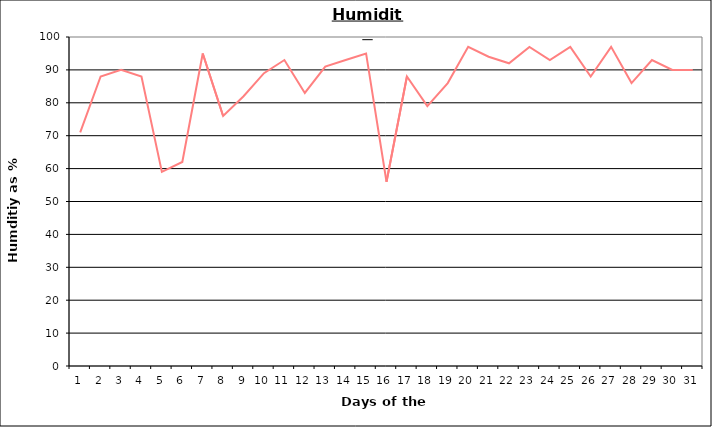
| Category | Series 0 |
|---|---|
| 0 | 71 |
| 1 | 88 |
| 2 | 90 |
| 3 | 88 |
| 4 | 59 |
| 5 | 62 |
| 6 | 95 |
| 7 | 76 |
| 8 | 82 |
| 9 | 89 |
| 10 | 93 |
| 11 | 83 |
| 12 | 91 |
| 13 | 93 |
| 14 | 95 |
| 15 | 56 |
| 16 | 88 |
| 17 | 79 |
| 18 | 86 |
| 19 | 97 |
| 20 | 94 |
| 21 | 92 |
| 22 | 97 |
| 23 | 93 |
| 24 | 97 |
| 25 | 88 |
| 26 | 97 |
| 27 | 86 |
| 28 | 93 |
| 29 | 90 |
| 30 | 90 |